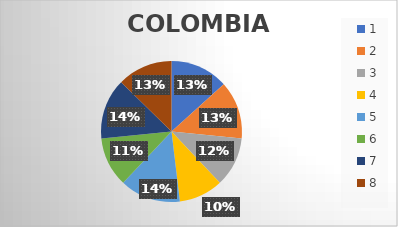
| Category | COLOMBIA ESCUCHA |
|---|---|
| 0 | 21 |
| 1 | 21 |
| 2 | 18 |
| 3 | 16 |
| 4 | 22 |
| 5 | 18 |
| 6 | 22 |
| 7 | 20 |